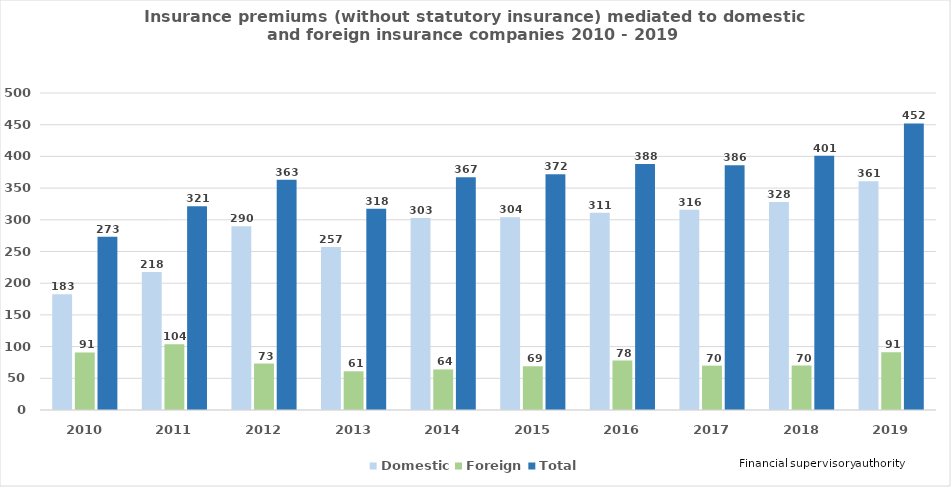
| Category | Domestic | Foreign | Total |
|---|---|---|---|
| 2010.0 | 182.562 | 90.729 | 273.291 |
| 2011.0 | 217.55 | 103.894 | 321.444 |
| 2012.0 | 289.922 | 73.321 | 363.243 |
| 2013.0 | 257 | 61 | 317.523 |
| 2014.0 | 303 | 64 | 367 |
| 2015.0 | 304 | 69 | 372 |
| 2016.0 | 311 | 78 | 388 |
| 2017.0 | 316 | 70 | 386 |
| 2018.0 | 328 | 70 | 401 |
| 2019.0 | 361 | 91 | 452 |